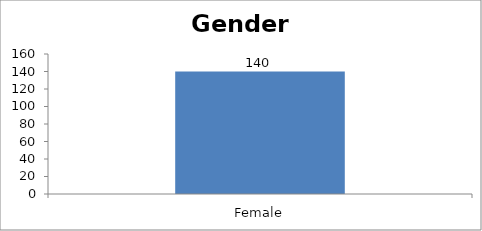
| Category | Gender |
|---|---|
| Female | 140 |